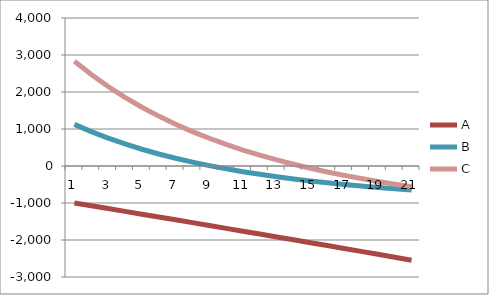
| Category | A | B | C |
|---|---|---|---|
| 0 | -1000 | 1125 | 2833 |
| 1 | -1075.124 | 929 | 2473 |
| 2 | -1150.495 | 753 | 2148 |
| 3 | -1226.108 | 595 | 1854 |
| 4 | -1302 | 453 | 1588 |
| 5 | -1378 | 325 | 1348 |
| 6 | -1454 | 209 | 1129 |
| 7 | -1531 | 105 | 930 |
| 8 | -1608 | 10 | 749 |
| 9 | -1685 | -76 | 583 |
| 10 | -1762 | -154 | 431 |
| 11 | -1839 | -225 | 292 |
| 12 | -1917 | -290 | 165 |
| 13 | -1995 | -349 | 47 |
| 14 | -2073 | -404 | -61 |
| 15 | -2151 | -454 | -161 |
| 16 | -2230 | -500 | -253 |
| 17 | -2308 | -542 | -339 |
| 18 | -2387 | -581 | -419 |
| 19 | -2466 | -618 | -493 |
| 20 | -2545 | -651 | -561 |